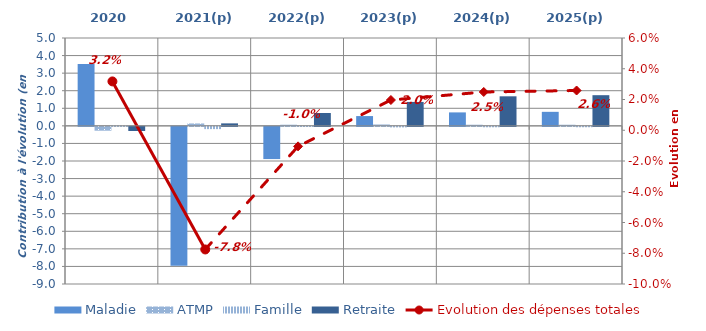
| Category | Maladie | ATMP | Famille | Retraite |
|---|---|---|---|---|
| 2020 | 3.515 | -0.219 | 0.018 | -0.235 |
| 2021(p) | -7.903 | 0.137 | -0.129 | 0.142 |
| 2022(p) | -1.833 | 0.065 | -0.009 | 0.73 |
| 2023(p) | 0.557 | 0.079 | -0.03 | 1.361 |
| 2024(p) | 0.766 | 0.065 | -0.024 | 1.681 |
| 2025(p) | 0.798 | 0.064 | -0.023 | 1.746 |